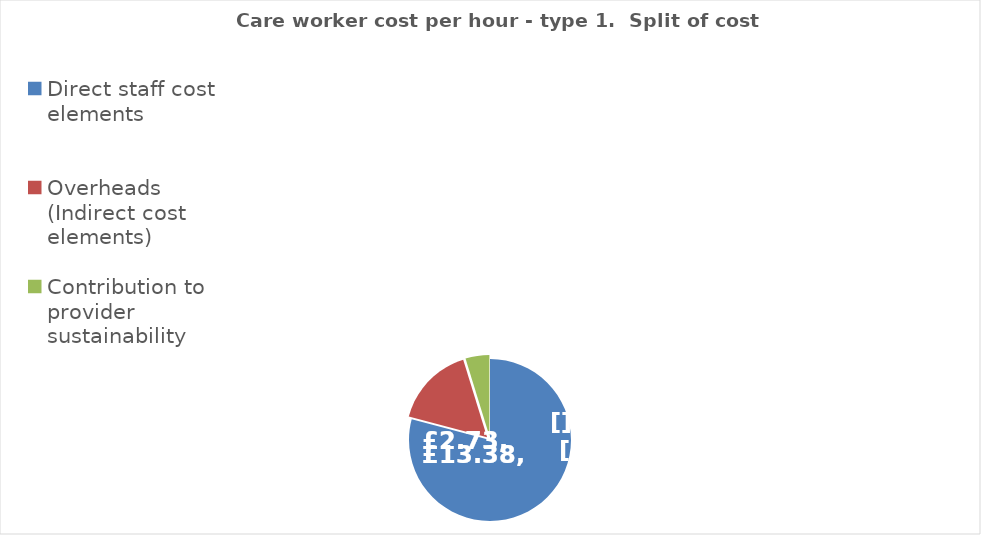
| Category | Series 0 |
|---|---|
| Direct staff cost elements | 13.38 |
| Overheads (Indirect cost elements) | 2.725 |
| Contribution to provider sustainability | 0.805 |